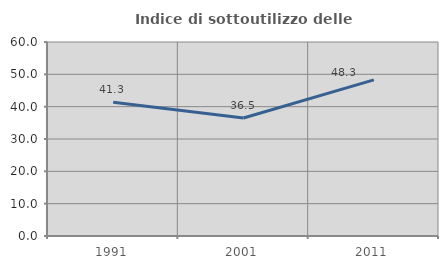
| Category | Indice di sottoutilizzo delle abitazioni  |
|---|---|
| 1991.0 | 41.332 |
| 2001.0 | 36.496 |
| 2011.0 | 48.272 |